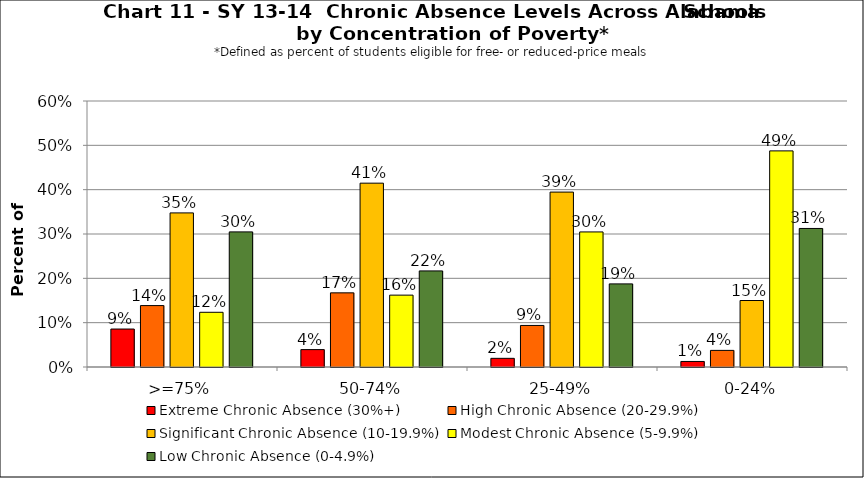
| Category | Extreme Chronic Absence (30%+) | High Chronic Absence (20-29.9%) | Significant Chronic Absence (10-19.9%) | Modest Chronic Absence (5-9.9%) | Low Chronic Absence (0-4.9%) |
|---|---|---|---|---|---|
| 0 | 0.086 | 0.139 | 0.348 | 0.123 | 0.305 |
| 1 | 0.039 | 0.167 | 0.415 | 0.162 | 0.217 |
| 2 | 0.02 | 0.094 | 0.395 | 0.305 | 0.188 |
| 3 | 0.012 | 0.038 | 0.15 | 0.488 | 0.312 |